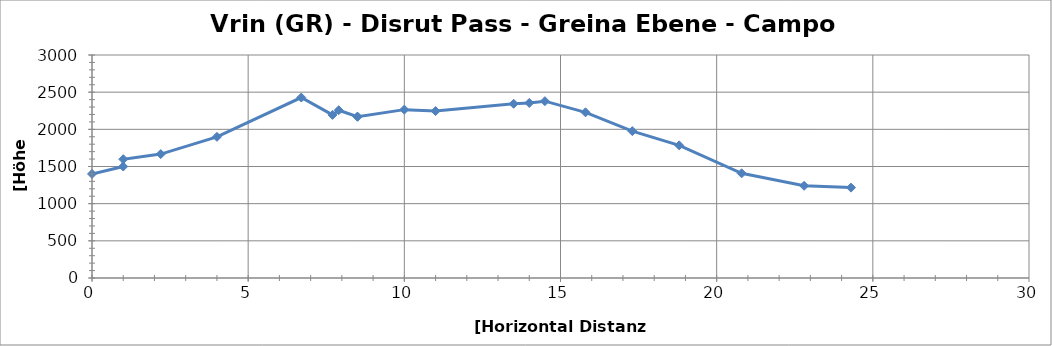
| Category | Vrin (GR) - Disrut Pass - Greina Ebene - Campo (Blenio) |
|---|---|
| 0.0 | 1400 |
| 1.0 | 1500 |
| 1.0 | 1598 |
| 2.2 | 1667 |
| 4.0 | 1899 |
| 6.7 | 2428 |
| 7.7 | 2194 |
| 7.9 | 2257 |
| 8.5 | 2170 |
| 8.5 | 2170 |
| 10.0 | 2265 |
| 11.0 | 2246 |
| 13.5 | 2344 |
| 14.0 | 2355 |
| 14.5 | 2379 |
| 15.8 | 2229 |
| 17.3 | 1976 |
| 18.8 | 1784 |
| 20.8 | 1408 |
| 22.8 | 1240 |
| 24.3 | 1216 |